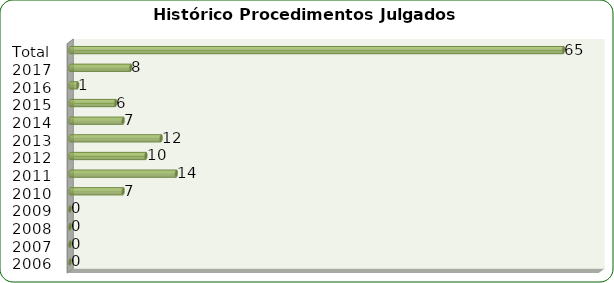
| Category | Total de Sindicâncias  |
|---|---|
| 2006 | 0 |
| 2007 | 0 |
| 2008 | 0 |
| 2009 | 0 |
| 2010 | 7 |
| 2011 | 14 |
| 2012 | 10 |
| 2013 | 12 |
| 2014 | 7 |
| 2015 | 6 |
| 2016 | 1 |
| 2017 | 8 |
| Total | 65 |